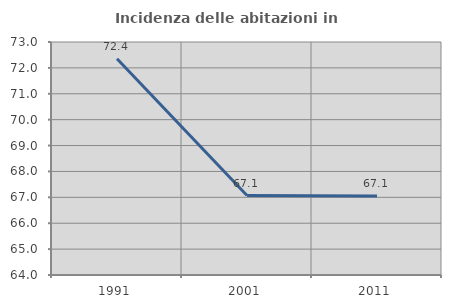
| Category | Incidenza delle abitazioni in proprietà  |
|---|---|
| 1991.0 | 72.35 |
| 2001.0 | 67.068 |
| 2011.0 | 67.054 |